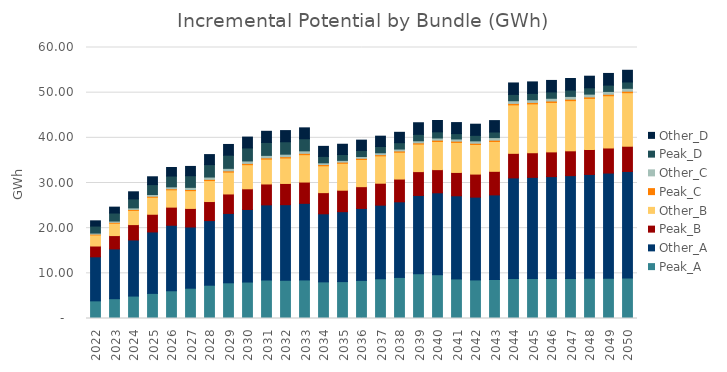
| Category | Peak_A | Other_A | Peak_B | Other_B | Peak_C | Other_C | Peak_D | Other_D |
|---|---|---|---|---|---|---|---|---|
| 2022.0 | 3.908 | 9.751 | 2.391 | 2.445 | 0.177 | 0.242 | 1.548 | 1.161 |
| 2023.0 | 4.388 | 11.02 | 2.951 | 2.737 | 0.194 | 0.288 | 1.773 | 1.305 |
| 2024.0 | 4.965 | 12.427 | 3.397 | 3.149 | 0.21 | 0.338 | 1.99 | 1.575 |
| 2025.0 | 5.56 | 13.604 | 3.916 | 3.763 | 0.224 | 0.381 | 2.196 | 1.731 |
| 2026.0 | 6.143 | 14.504 | 4.01 | 3.83 | 0.239 | 0.422 | 2.392 | 1.888 |
| 2027.0 | 6.706 | 13.553 | 4.112 | 3.939 | 0.253 | 0.472 | 2.578 | 2.055 |
| 2028.0 | 7.372 | 14.306 | 4.219 | 4.645 | 0.264 | 0.513 | 2.752 | 2.219 |
| 2029.0 | 7.905 | 15.356 | 4.313 | 4.841 | 0.276 | 0.554 | 2.912 | 2.378 |
| 2030.0 | 8.069 | 16.07 | 4.577 | 5.335 | 0.283 | 0.549 | 2.876 | 2.407 |
| 2031.0 | 8.52 | 16.643 | 4.623 | 5.495 | 0.287 | 0.548 | 2.859 | 2.472 |
| 2032.0 | 8.465 | 16.735 | 4.698 | 5.639 | 0.291 | 0.552 | 2.749 | 2.473 |
| 2033.0 | 8.535 | 16.962 | 4.714 | 6.06 | 0.293 | 0.555 | 2.68 | 2.41 |
| 2034.0 | 8.112 | 15.068 | 4.688 | 5.945 | 0.275 | 0.38 | 1.417 | 2.228 |
| 2035.0 | 8.169 | 15.482 | 4.753 | 5.966 | 0.252 | 0.39 | 1.295 | 2.275 |
| 2036.0 | 8.437 | 15.934 | 4.818 | 6.017 | 0.265 | 0.402 | 1.342 | 2.278 |
| 2037.0 | 8.796 | 16.3 | 4.856 | 6.059 | 0.264 | 0.417 | 1.384 | 2.292 |
| 2038.0 | 9.097 | 16.738 | 5.036 | 5.949 | 0.269 | 0.428 | 1.409 | 2.297 |
| 2039.0 | 9.911 | 17.334 | 5.277 | 6.095 | 0.272 | 0.46 | 1.421 | 2.571 |
| 2040.0 | 9.696 | 18.136 | 5.127 | 6.23 | 0.294 | 0.487 | 1.357 | 2.511 |
| 2041.0 | 8.76 | 18.411 | 5.167 | 6.645 | 0.283 | 0.487 | 1.185 | 2.438 |
| 2042.0 | 8.54 | 18.332 | 5.102 | 6.544 | 0.284 | 0.529 | 1.222 | 2.466 |
| 2043.0 | 8.64 | 18.726 | 5.219 | 6.603 | 0.299 | 0.562 | 1.24 | 2.525 |
| 2044.0 | 8.832 | 22.292 | 5.443 | 10.729 | 0.321 | 0.597 | 1.398 | 2.537 |
| 2045.0 | 8.844 | 22.402 | 5.456 | 10.814 | 0.323 | 0.601 | 1.399 | 2.543 |
| 2046.0 | 8.86 | 22.555 | 5.474 | 10.941 | 0.324 | 0.606 | 1.399 | 2.55 |
| 2047.0 | 8.879 | 22.752 | 5.496 | 11.107 | 0.326 | 0.613 | 1.399 | 2.559 |
| 2048.0 | 8.901 | 22.992 | 5.521 | 11.314 | 0.328 | 0.621 | 1.4 | 2.569 |
| 2049.0 | 8.927 | 23.275 | 5.551 | 11.561 | 0.33 | 0.63 | 1.4 | 2.581 |
| 2050.0 | 8.957 | 23.602 | 5.584 | 11.849 | 0.333 | 0.64 | 1.4 | 2.595 |